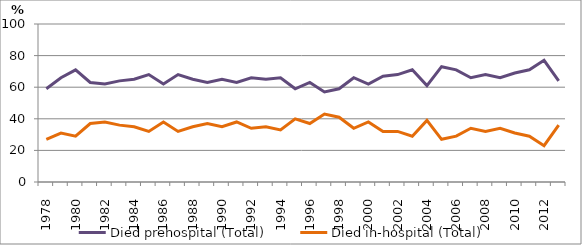
| Category | Died prehospital (Total) | Died in-hospital (Total) |
|---|---|---|
| 1978.0 | 59 | 27 |
| 1979.0 | 66 | 31 |
| 1980.0 | 71 | 29 |
| 1981.0 | 63 | 37 |
| 1982.0 | 62 | 38 |
| 1983.0 | 64 | 36 |
| 1984.0 | 65 | 35 |
| 1985.0 | 68 | 32 |
| 1986.0 | 62 | 38 |
| 1987.0 | 68 | 32 |
| 1988.0 | 65 | 35 |
| 1989.0 | 63 | 37 |
| 1990.0 | 65 | 35 |
| 1991.0 | 63 | 38 |
| 1992.0 | 66 | 34 |
| 1993.0 | 65 | 35 |
| 1994.0 | 66 | 33 |
| 1995.0 | 59 | 40 |
| 1996.0 | 63 | 37 |
| 1997.0 | 57 | 43 |
| 1998.0 | 59 | 41 |
| 1999.0 | 66 | 34 |
| 2000.0 | 62 | 38 |
| 2001.0 | 67 | 32 |
| 2002.0 | 68 | 32 |
| 2003.0 | 71 | 29 |
| 2004.0 | 61 | 39 |
| 2005.0 | 73 | 27 |
| 2006.0 | 71 | 29 |
| 2007.0 | 66 | 34 |
| 2008.0 | 68 | 32 |
| 2009.0 | 66 | 34 |
| 2010.0 | 69 | 31 |
| 2011.0 | 71 | 29 |
| 2012.0 | 77 | 23 |
| 2013.0 | 64 | 36 |